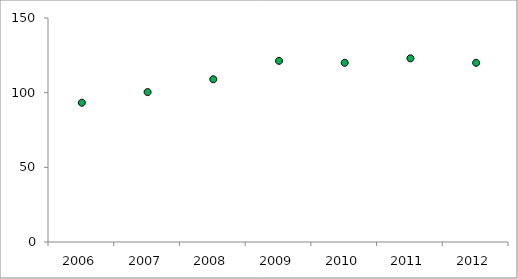
| Category | Нормированный рейтинг |
|---|---|
| 2006.0 | 93.271 |
| 2007.0 | 100.389 |
| 2008.0 | 108.978 |
| 2009.0 | 121.326 |
| 2010.0 | 120 |
| 2011.0 | 123 |
| 2012.0 | 120 |